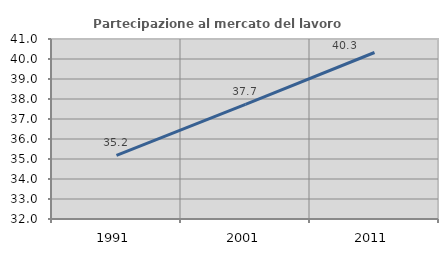
| Category | Partecipazione al mercato del lavoro  femminile |
|---|---|
| 1991.0 | 35.184 |
| 2001.0 | 37.731 |
| 2011.0 | 40.325 |